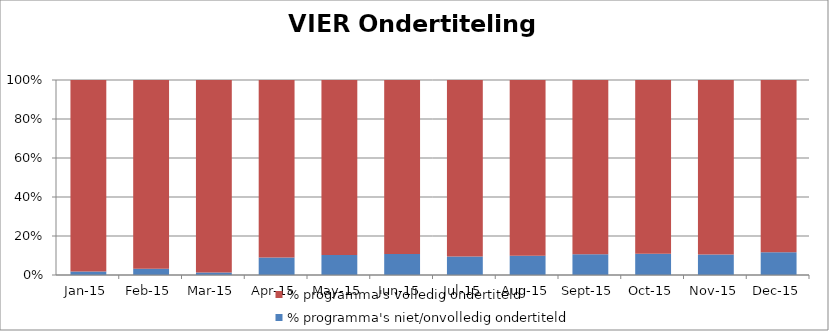
| Category | % programma's niet/onvolledig ondertiteld | % programma's volledig ondertiteld |
|---|---|---|
| 2015-01-01 | 0.018 | 0.982 |
| 2015-02-01 | 0.032 | 0.968 |
| 2015-03-01 | 0.012 | 0.988 |
| 2015-04-01 | 0.089 | 0.911 |
| 2015-05-01 | 0.102 | 0.898 |
| 2015-06-01 | 0.108 | 0.892 |
| 2015-07-01 | 0.095 | 0.905 |
| 2015-08-01 | 0.099 | 0.901 |
| 2015-09-01 | 0.107 | 0.893 |
| 2015-10-01 | 0.109 | 0.891 |
| 2015-11-01 | 0.106 | 0.894 |
| 2015-12-01 | 0.117 | 0.883 |